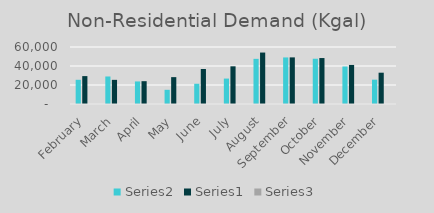
| Category | Series 1 | Series 0 | Series 2 |
|---|---|---|---|
| February | 25488 | 29366 | 0.868 |
| March | 28967 | 25412 | 1.14 |
| April | 23746 | 24018 | 0.989 |
| May | 14933 | 28279 | 0.528 |
| June | 21309 | 36817 | 0.579 |
| July | 26764 | 39671 | 0.675 |
| August | 47532 | 54156 | 0.878 |
| September | 49007 | 49071 | 0.999 |
| October | 47640 | 48372 | 0.985 |
| November | 39485 | 41110 | 0.96 |
| December | 25603 | 32951 | 0.777 |